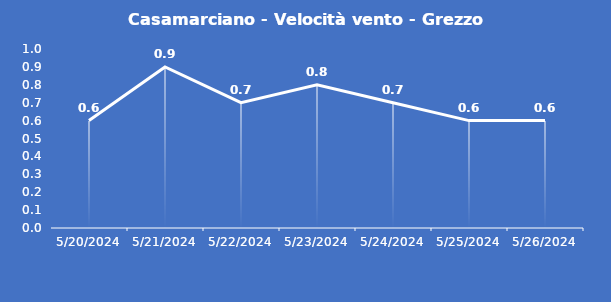
| Category | Casamarciano - Velocità vento - Grezzo (m/s) |
|---|---|
| 5/20/24 | 0.6 |
| 5/21/24 | 0.9 |
| 5/22/24 | 0.7 |
| 5/23/24 | 0.8 |
| 5/24/24 | 0.7 |
| 5/25/24 | 0.6 |
| 5/26/24 | 0.6 |